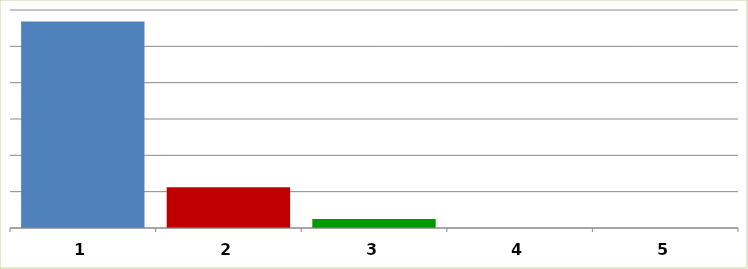
| Category | Series 0 |
|---|---|
| 0 | 56815335 |
| 1 | 11186626 |
| 2 | 2503716 |
| 3 | 0 |
| 4 | 0 |